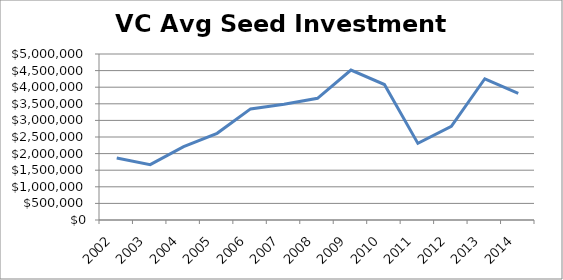
| Category | Series 0 |
|---|---|
| 2002.0 | 1868131.868 |
| 2003.0 | 1666666.667 |
| 2004.0 | 2209401.709 |
| 2005.0 | 2610687.023 |
| 2006.0 | 3346633.416 |
| 2007.0 | 3489523.81 |
| 2008.0 | 3664794.007 |
| 2009.0 | 4514745.308 |
| 2010.0 | 4081081.081 |
| 2011.0 | 2308219.178 |
| 2012.0 | 2817880.795 |
| 2013.0 | 4254166.667 |
| 2014.0 | 3815384.615 |